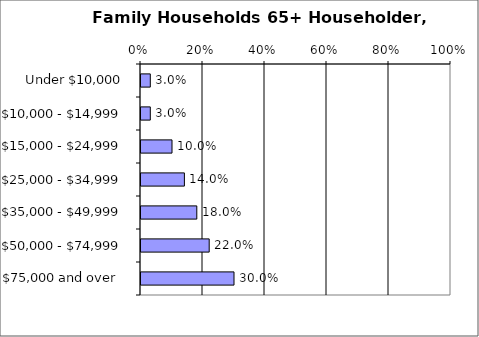
| Category | Series 0 |
|---|---|
| Under $10,000 | 0.03 |
| $10,000 - $14,999 | 0.03 |
| $15,000 - $24,999 | 0.1 |
| $25,000 - $34,999 | 0.14 |
| $35,000 - $49,999 | 0.18 |
| $50,000 - $74,999 | 0.22 |
| $75,000 and over  | 0.3 |